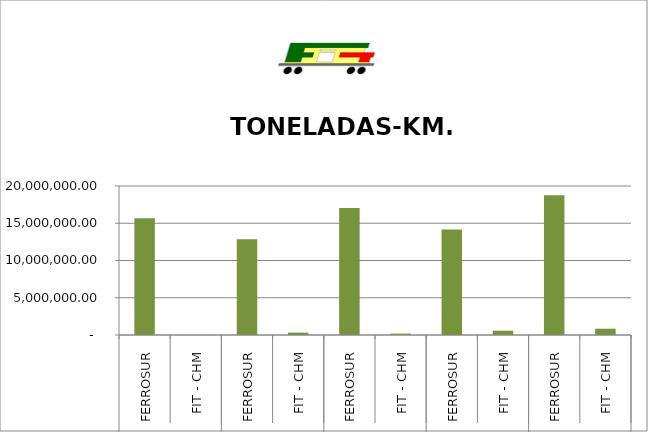
| Category | TONELADAS-KM. BRUTAS |
|---|---|
| 0 | 15656460 |
| 1 | 19080 |
| 2 | 12842887.5 |
| 3 | 317340 |
| 4 | 17042010 |
| 5 | 187260 |
| 6 | 14177657.5 |
| 7 | 581170 |
| 8 | 18760382.5 |
| 9 | 842287.5 |